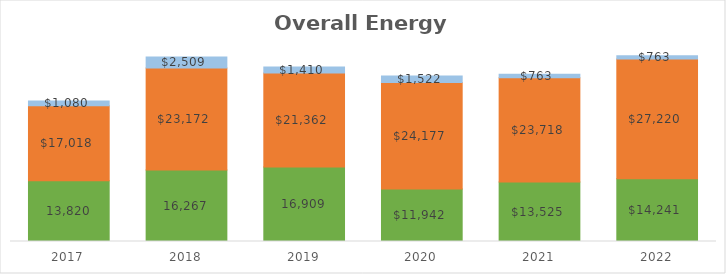
| Category | Electric | Gas | Water |
|---|---|---|---|
| 2017.0 | 13819.83 | 17018.44 | 1079.86 |
| 2018.0 | 16266.8 | 23172.13 | 2509.44 |
| 2019.0 | 16908.56 | 21361.915 | 1410.41 |
| 2020.0 | 11941.7 | 24176.96 | 1521.55 |
| 2021.0 | 13524.81 | 23717.65 | 762.54 |
| 2022.0 | 14241 | 27220.35 | 763 |